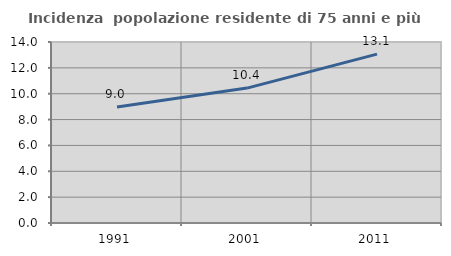
| Category | Incidenza  popolazione residente di 75 anni e più |
|---|---|
| 1991.0 | 8.98 |
| 2001.0 | 10.434 |
| 2011.0 | 13.061 |